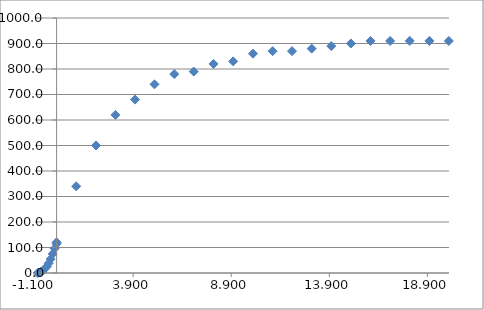
| Category | Series 0 |
|---|---|
| -0.96 | 0 |
| -0.9 | 1.4 |
| -0.8 | 4.5 |
| -0.7 | 9.1 |
| -0.601 | 15.9 |
| -0.5 | 25.5 |
| -0.4 | 38.3 |
| -0.3 | 54.7 |
| -0.2 | 74.4 |
| -0.1 | 96.1 |
| 0.0 | 120.4 |
| 0.0 | 114.4 |
| 1.0 | 340 |
| 2.01 | 500 |
| 3.0 | 620 |
| 4.0 | 680 |
| 4.99 | 740 |
| 6.0 | 780 |
| 6.99 | 790 |
| 8.0 | 820 |
| 9.0 | 830 |
| 10.01 | 860 |
| 11.01 | 870 |
| 12.0 | 870 |
| 13.0 | 880 |
| 14.0 | 890 |
| 15.0 | 900 |
| 16.0 | 910 |
| 17.0 | 910 |
| 18.0 | 910 |
| 19.0 | 910 |
| 19.99 | 910 |